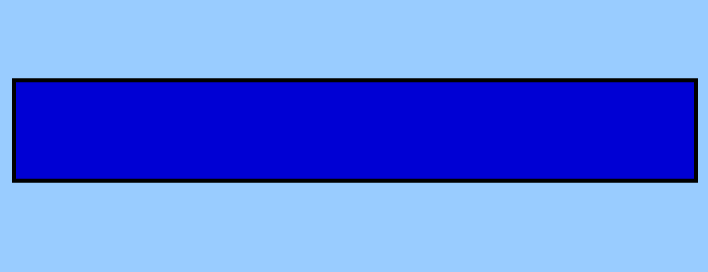
| Category | Series 0 | Series 1 | Series 2 | Series 3 | Series 4 | Series 5 | Series 6 | Series 7 | Series 8 | Series 9 |
|---|---|---|---|---|---|---|---|---|---|---|
| 0 | 1 | 0 | 0 | 0 | 0 | 0 | 0 | 0 | 0 | 0 |